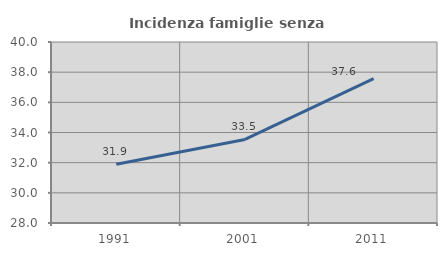
| Category | Incidenza famiglie senza nuclei |
|---|---|
| 1991.0 | 31.896 |
| 2001.0 | 33.542 |
| 2011.0 | 37.57 |